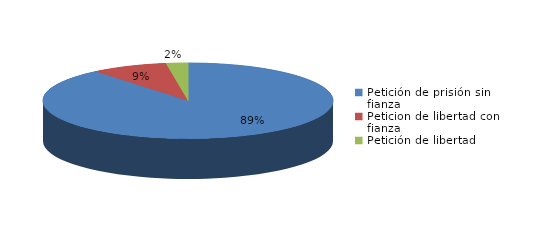
| Category | Series 0 |
|---|---|
| Petición de prisión sin fianza | 146 |
| Peticion de libertad con fianza | 14 |
| Petición de libertad | 4 |